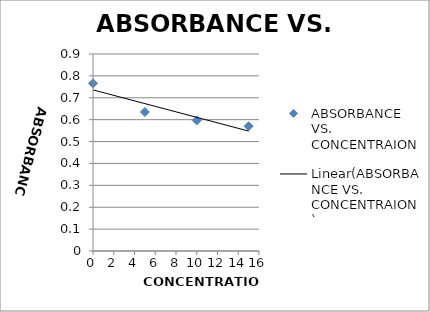
| Category | ABSORBANCE VS. CONCENTRAION |
|---|---|
| 0.0 | 0.766 |
| 5.0 | 0.635 |
| 10.0 | 0.597 |
| 15.0 | 0.57 |